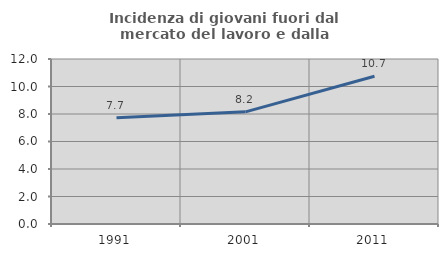
| Category | Incidenza di giovani fuori dal mercato del lavoro e dalla formazione  |
|---|---|
| 1991.0 | 7.734 |
| 2001.0 | 8.157 |
| 2011.0 | 10.748 |